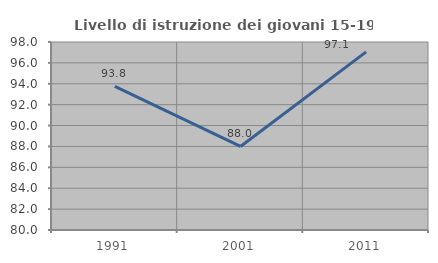
| Category | Livello di istruzione dei giovani 15-19 anni |
|---|---|
| 1991.0 | 93.75 |
| 2001.0 | 88 |
| 2011.0 | 97.059 |